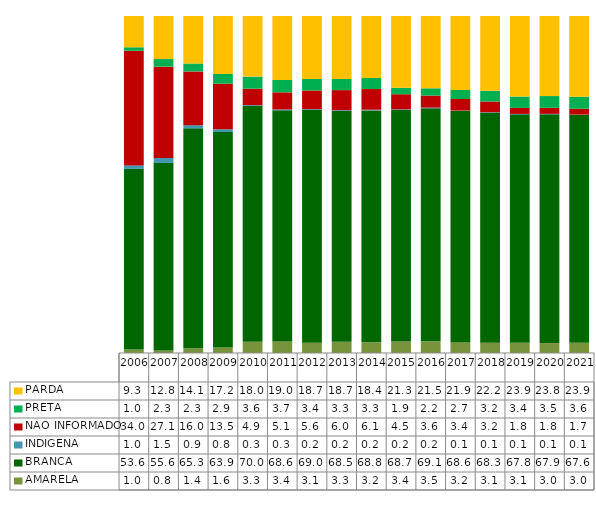
| Category | AMARELA | BRANCA | INDIGENA | NAO INFORMADO | PRETA | PARDA |
|---|---|---|---|---|---|---|
| 2006.0 | 0.01 | 0.536 | 0.01 | 0.34 | 0.01 | 0.093 |
| 2007.0 | 0.008 | 0.556 | 0.015 | 0.271 | 0.023 | 0.128 |
| 2008.0 | 0.014 | 0.653 | 0.009 | 0.16 | 0.023 | 0.141 |
| 2009.0 | 0.016 | 0.639 | 0.008 | 0.135 | 0.029 | 0.172 |
| 2010.0 | 0.033 | 0.7 | 0.003 | 0.049 | 0.036 | 0.18 |
| 2011.0 | 0.034 | 0.686 | 0.003 | 0.051 | 0.037 | 0.19 |
| 2012.0 | 0.031 | 0.69 | 0.002 | 0.056 | 0.034 | 0.187 |
| 2013.0 | 0.033 | 0.685 | 0.002 | 0.06 | 0.033 | 0.187 |
| 2014.0 | 0.032 | 0.688 | 0.002 | 0.061 | 0.033 | 0.184 |
| 2015.0 | 0.034 | 0.687 | 0.002 | 0.045 | 0.019 | 0.213 |
| 2016.0 | 0.035 | 0.691 | 0.002 | 0.036 | 0.022 | 0.215 |
| 2017.0 | 0.032 | 0.686 | 0.001 | 0.034 | 0.027 | 0.219 |
| 2018.0 | 0.031 | 0.683 | 0.001 | 0.032 | 0.032 | 0.222 |
| 2019.0 | 0.031 | 0.678 | 0.001 | 0.018 | 0.034 | 0.239 |
| 2020.0 | 0.03 | 0.679 | 0.001 | 0.018 | 0.035 | 0.238 |
| 2021.0 | 0.03 | 0.676 | 0.001 | 0.017 | 0.036 | 0.239 |